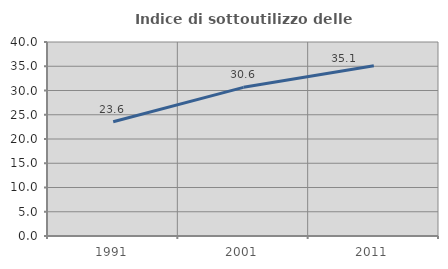
| Category | Indice di sottoutilizzo delle abitazioni  |
|---|---|
| 1991.0 | 23.571 |
| 2001.0 | 30.65 |
| 2011.0 | 35.124 |